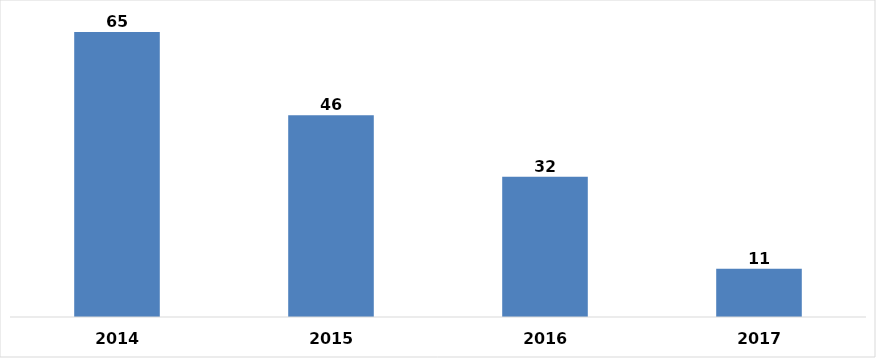
| Category | 2014 |
|---|---|
| 0 | 65 |
| 1 | 46 |
| 2 | 32 |
| 3 | 11 |